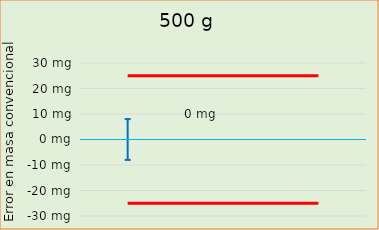
| Category | Error en masa convencional  |  ± EMP |
|---|---|---|
| 0 |  | -25 |
| 1 |  | -25 |
| 2 |  | -25 |